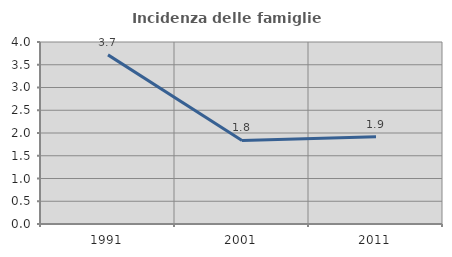
| Category | Incidenza delle famiglie numerose |
|---|---|
| 1991.0 | 3.717 |
| 2001.0 | 1.837 |
| 2011.0 | 1.917 |